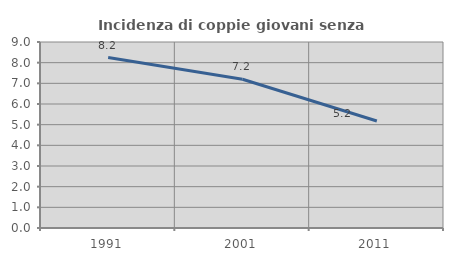
| Category | Incidenza di coppie giovani senza figli |
|---|---|
| 1991.0 | 8.247 |
| 2001.0 | 7.197 |
| 2011.0 | 5.179 |